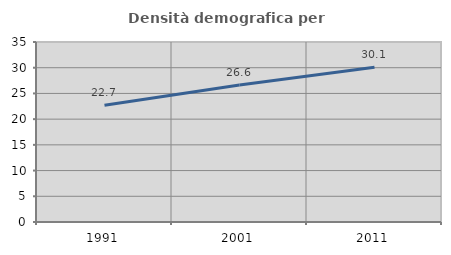
| Category | Densità demografica |
|---|---|
| 1991.0 | 22.698 |
| 2001.0 | 26.638 |
| 2011.0 | 30.083 |